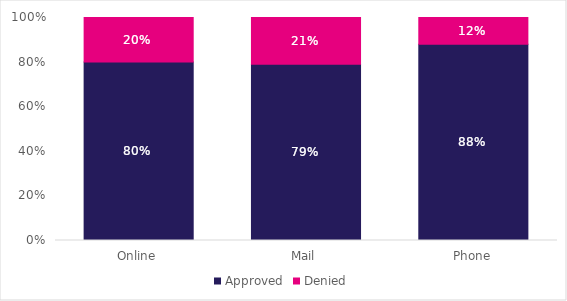
| Category | Approved | Denied |
|---|---|---|
| Online | 0.8 | 0.2 |
| Mail | 0.79 | 0.21 |
| Phone | 0.88 | 0.12 |